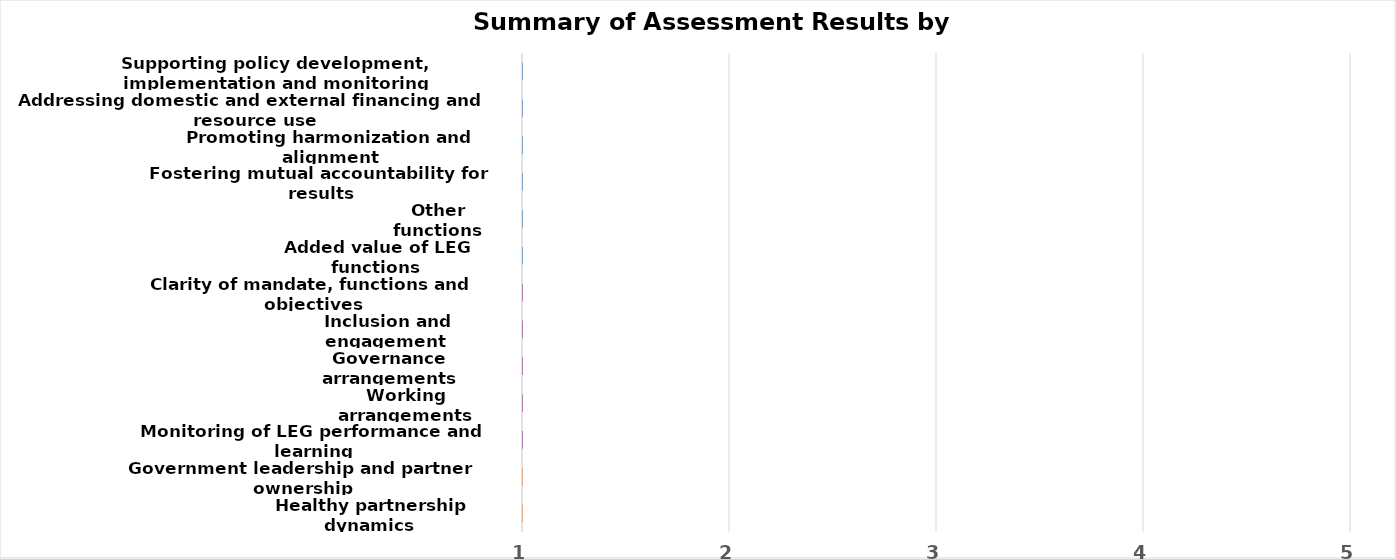
| Category | Series 0 |
|---|---|
| Supporting policy development, implementation and monitoring | 0 |
| Addressing domestic and external financing and resource use | 0 |
| Promoting harmonization and alignment | 0 |
| Fostering mutual accountability for results | 0 |
| Other functions | 0 |
|  Added value of LEG functions | 0 |
| Clarity of mandate, functions and objectives | 0 |
| Inclusion and engagement  | 0 |
| Governance arrangements | 0 |
| Working arrangements | 0 |
| Monitoring of LEG performance and learning | 0 |
| Government leadership and partner ownership | 0 |
| Healthy partnership dynamics  | 0 |